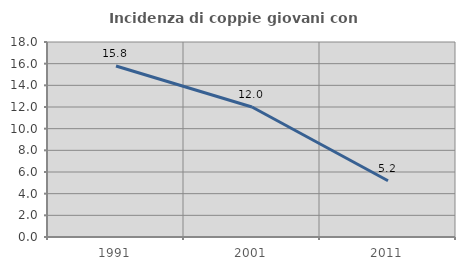
| Category | Incidenza di coppie giovani con figli |
|---|---|
| 1991.0 | 15.789 |
| 2001.0 | 12 |
| 2011.0 | 5.195 |